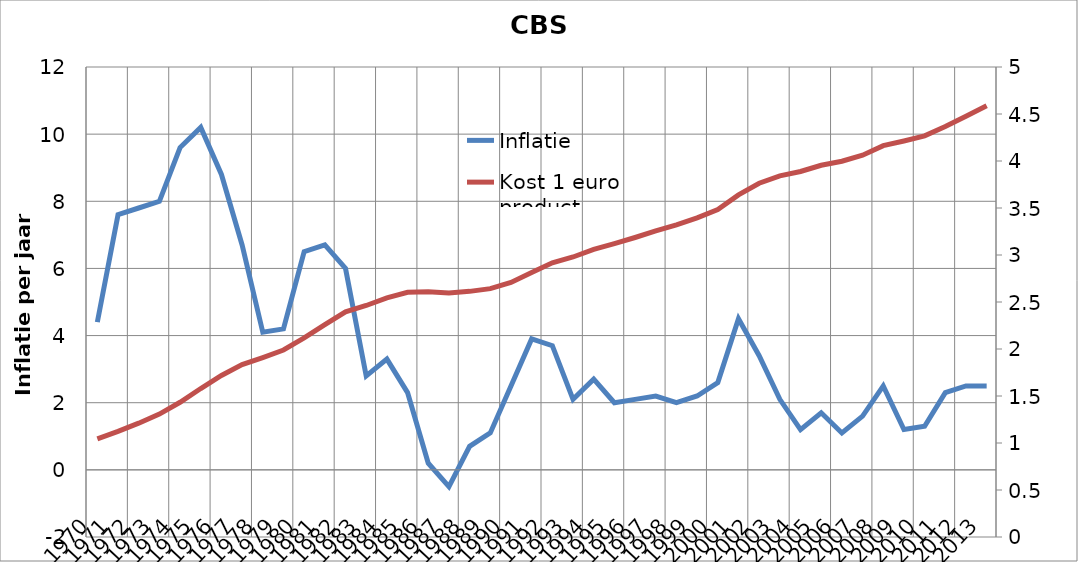
| Category | Inflatie |
|---|---|
| 1970 | 4.4 |
| 1971 | 7.6 |
| 1972 | 7.8 |
| 1973 | 8 |
| 1974 | 9.6 |
| 1975 | 10.2 |
| 1976 | 8.8 |
| 1977 | 6.7 |
| 1978 | 4.1 |
| 1979 | 4.2 |
| 1980 | 6.5 |
| 1981 | 6.7 |
| 1982 | 6 |
| 1983 | 2.8 |
| 1984 | 3.3 |
| 1985 | 2.3 |
| 1986 | 0.2 |
| 1987 | -0.5 |
| 1988 | 0.7 |
| 1989 | 1.1 |
| 1990 | 2.5 |
| 1991 | 3.9 |
| 1992 | 3.7 |
| 1993 | 2.1 |
| 1994 | 2.7 |
| 1995 | 2 |
| 1996 | 2.1 |
| 1997 | 2.2 |
| 1998 | 2 |
| 1999 | 2.2 |
| 2000 | 2.6 |
| 2001 | 4.5 |
| 2002 | 3.4 |
| 2003 | 2.1 |
| 2004 | 1.2 |
| 2005 | 1.7 |
| 2006 | 1.1 |
| 2007 | 1.6 |
| 2008 | 2.5 |
| 2009 | 1.2 |
| 2010 | 1.3 |
| 2011 | 2.3 |
| 2012 | 2.5 |
| 2013 | 2.5 |